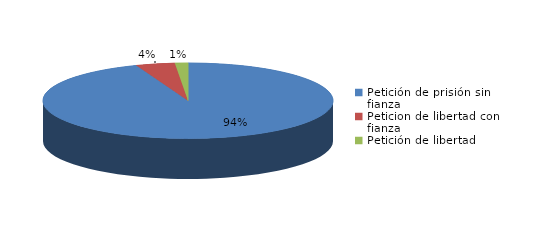
| Category | Series 0 |
|---|---|
| Petición de prisión sin fianza | 130 |
| Peticion de libertad con fianza | 6 |
| Petición de libertad | 2 |